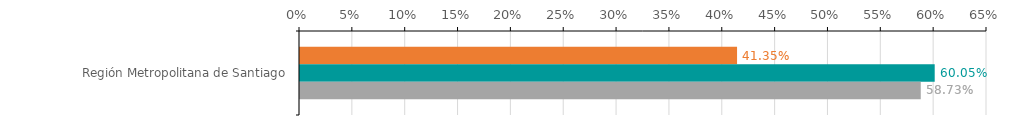
| Category | Numero de operaciones | Monto ($ MM) | Garantia ($ MM) |
|---|---|---|---|
| Región Metropolitana de Santiago | 0.414 | 0.601 | 0.587 |